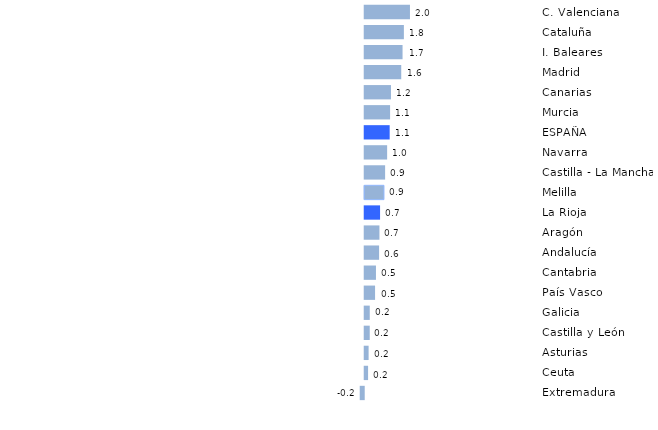
| Category | Series 0 |
|---|---|
| Extremadura | -0.18 |
| Ceuta | 0.151 |
| Asturias  | 0.175 |
| Castilla y León | 0.226 |
| Galicia | 0.227 |
| País Vasco | 0.466 |
| Cantabria | 0.506 |
| Andalucía | 0.648 |
| Aragón | 0.663 |
| La Rioja | 0.691 |
| Melilla | 0.867 |
| Castilla - La Mancha | 0.919 |
| Navarra  | 1.01 |
| ESPAÑA | 1.125 |
| Murcia | 1.143 |
| Canarias | 1.183 |
| Madrid | 1.646 |
| I. Baleares | 1.705 |
| Cataluña | 1.765 |
| C. Valenciana | 2.039 |